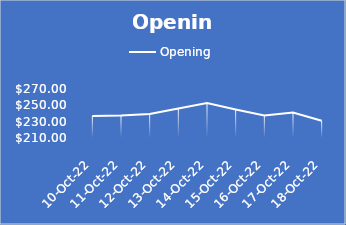
| Category | Opening |
|---|---|
| 2022-10-10 | 237 |
| 2022-10-11 | 237.56 |
| 2022-10-12 | 239.6 |
| 2022-10-13 | 246.4 |
| 2022-10-14 | 253 |
| 2022-10-15 | 245 |
| 2022-10-16 | 237.58 |
| 2022-10-17 | 241.35 |
| 2022-10-18 | 231.17 |